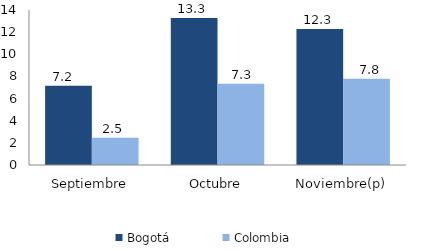
| Category | Bogotá | Colombia |
|---|---|---|
| Septiembre | 7.151 | 2.46 |
| Octubre | 13.275 | 7.33 |
| Noviembre(p) | 12.278 | 7.786 |